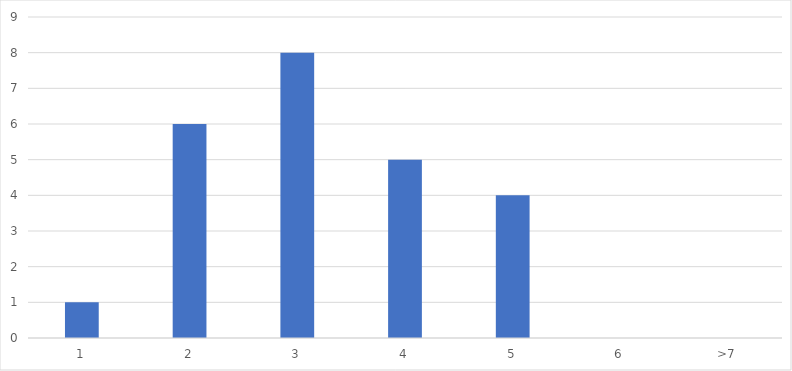
| Category | Number of Responses |
|---|---|
| 1 | 1 |
| 2 | 6 |
| 3 | 8 |
| 4 | 5 |
| 5 | 4 |
| 6 | 0 |
| >7 | 0 |